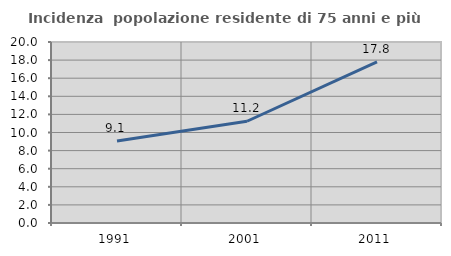
| Category | Incidenza  popolazione residente di 75 anni e più |
|---|---|
| 1991.0 | 9.055 |
| 2001.0 | 11.244 |
| 2011.0 | 17.814 |